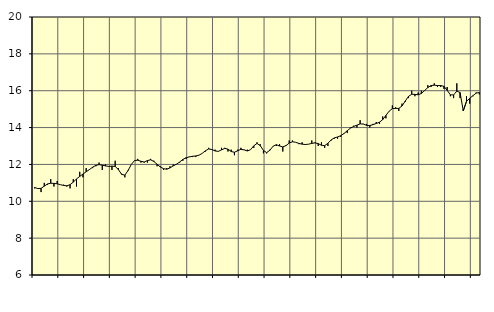
| Category | Piggar | Utbildning, SNI 851 |
|---|---|---|
| nan | 10.7 | 10.75 |
| 87.0 | 10.7 | 10.69 |
| 87.0 | 10.5 | 10.7 |
| 87.0 | 11 | 10.82 |
| nan | 10.9 | 10.94 |
| 88.0 | 11.2 | 10.98 |
| 88.0 | 10.8 | 10.97 |
| 88.0 | 11.1 | 10.95 |
| nan | 10.9 | 10.9 |
| 89.0 | 10.9 | 10.86 |
| 89.0 | 10.8 | 10.84 |
| 89.0 | 10.7 | 10.9 |
| nan | 11.2 | 11.04 |
| 90.0 | 10.8 | 11.21 |
| 90.0 | 11.6 | 11.35 |
| 90.0 | 11.3 | 11.48 |
| nan | 11.8 | 11.6 |
| 91.0 | 11.7 | 11.72 |
| 91.0 | 11.8 | 11.85 |
| 91.0 | 11.9 | 11.95 |
| nan | 12.1 | 11.99 |
| 92.0 | 11.7 | 11.96 |
| 92.0 | 12 | 11.92 |
| 92.0 | 11.9 | 11.89 |
| nan | 11.7 | 11.91 |
| 93.0 | 12.2 | 11.89 |
| 93.0 | 11.8 | 11.72 |
| 93.0 | 11.5 | 11.46 |
| nan | 11.3 | 11.42 |
| 94.0 | 11.7 | 11.67 |
| 94.0 | 12 | 12 |
| 94.0 | 12.2 | 12.21 |
| nan | 12.3 | 12.23 |
| 95.0 | 12.1 | 12.17 |
| 95.0 | 12.1 | 12.13 |
| 95.0 | 12.1 | 12.21 |
| nan | 12.3 | 12.25 |
| 96.0 | 12.2 | 12.16 |
| 96.0 | 11.9 | 12.01 |
| 96.0 | 11.9 | 11.86 |
| nan | 11.7 | 11.77 |
| 97.0 | 11.8 | 11.74 |
| 97.0 | 11.9 | 11.81 |
| 97.0 | 12 | 11.92 |
| nan | 12 | 12.01 |
| 98.0 | 12.1 | 12.13 |
| 98.0 | 12.2 | 12.27 |
| 98.0 | 12.3 | 12.36 |
| nan | 12.4 | 12.41 |
| 99.0 | 12.4 | 12.44 |
| 99.0 | 12.4 | 12.46 |
| 99.0 | 12.5 | 12.5 |
| nan | 12.6 | 12.6 |
| 0.0 | 12.7 | 12.74 |
| 0.0 | 12.9 | 12.84 |
| 0.0 | 12.8 | 12.81 |
| nan | 12.8 | 12.73 |
| 1.0 | 12.7 | 12.71 |
| 1.0 | 12.9 | 12.79 |
| 1.0 | 12.9 | 12.87 |
| nan | 12.7 | 12.83 |
| 2.0 | 12.8 | 12.7 |
| 2.0 | 12.5 | 12.66 |
| 2.0 | 12.8 | 12.74 |
| nan | 12.9 | 12.82 |
| 3.0 | 12.8 | 12.79 |
| 3.0 | 12.8 | 12.73 |
| 3.0 | 12.8 | 12.8 |
| nan | 12.9 | 13.01 |
| 4.0 | 13.2 | 13.14 |
| 4.0 | 13.1 | 13.02 |
| 4.0 | 12.6 | 12.76 |
| nan | 12.6 | 12.64 |
| 5.0 | 12.8 | 12.77 |
| 5.0 | 13 | 12.99 |
| 5.0 | 13 | 13.07 |
| nan | 13.1 | 13 |
| 6.0 | 12.7 | 12.95 |
| 6.0 | 13 | 13.02 |
| 6.0 | 13.3 | 13.16 |
| nan | 13.3 | 13.23 |
| 7.0 | 13.2 | 13.2 |
| 7.0 | 13.1 | 13.14 |
| 7.0 | 13.2 | 13.1 |
| nan | 13.1 | 13.08 |
| 8.0 | 13.1 | 13.1 |
| 8.0 | 13.3 | 13.14 |
| 8.0 | 13.2 | 13.17 |
| nan | 13 | 13.13 |
| 9.0 | 13.2 | 13.04 |
| 9.0 | 12.9 | 13.02 |
| 9.0 | 13 | 13.15 |
| nan | 13.3 | 13.33 |
| 10.0 | 13.4 | 13.44 |
| 10.0 | 13.4 | 13.49 |
| 10.0 | 13.5 | 13.56 |
| nan | 13.7 | 13.68 |
| 11.0 | 13.7 | 13.83 |
| 11.0 | 14 | 13.97 |
| 11.0 | 14.1 | 14.06 |
| nan | 14 | 14.13 |
| 12.0 | 14.4 | 14.2 |
| 12.0 | 14.2 | 14.19 |
| 12.0 | 14.2 | 14.12 |
| nan | 14 | 14.11 |
| 13.0 | 14.2 | 14.16 |
| 13.0 | 14.3 | 14.22 |
| 13.0 | 14.2 | 14.29 |
| nan | 14.6 | 14.43 |
| 14.0 | 14.5 | 14.66 |
| 14.0 | 14.9 | 14.89 |
| 14.0 | 15.2 | 15.03 |
| nan | 15.1 | 15.04 |
| 15.0 | 14.9 | 15.04 |
| 15.0 | 15.3 | 15.17 |
| 15.0 | 15.4 | 15.44 |
| nan | 15.6 | 15.69 |
| 16.0 | 16 | 15.81 |
| 16.0 | 15.7 | 15.8 |
| 16.0 | 15.9 | 15.78 |
| nan | 16 | 15.85 |
| 17.0 | 16 | 16.01 |
| 17.0 | 16.3 | 16.17 |
| 17.0 | 16.2 | 16.28 |
| nan | 16.4 | 16.3 |
| 18.0 | 16.2 | 16.28 |
| 18.0 | 16.2 | 16.28 |
| 18.0 | 16.1 | 16.24 |
| nan | 16.2 | 16.02 |
| 19.0 | 15.7 | 15.78 |
| 19.0 | 15.6 | 15.77 |
| 19.0 | 16.4 | 15.98 |
| nan | 15.6 | 15.9 |
| 20.0 | 15 | 14.91 |
| 20.0 | 15.7 | 15.42 |
| 20.0 | 15.3 | 15.59 |
| nan | 15.7 | 15.73 |
| 21.0 | 15.9 | 15.87 |
| 21.0 | 15.8 | 15.9 |